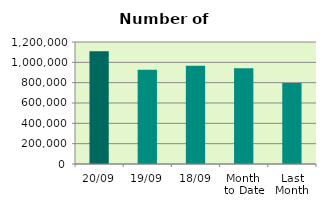
| Category | Series 0 |
|---|---|
| 20/09 | 1108320 |
| 19/09 | 927206 |
| 18/09 | 966218 |
| Month 
to Date | 942582.429 |
| Last
Month | 797310 |